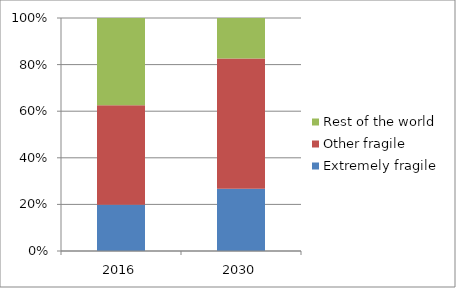
| Category | Extremely fragile | Other fragile | Rest of the world |
|---|---|---|---|
| 2016.0 | 19.803 | 42.727 | 37.47 |
| 2030.0 | 26.707 | 55.858 | 17.435 |